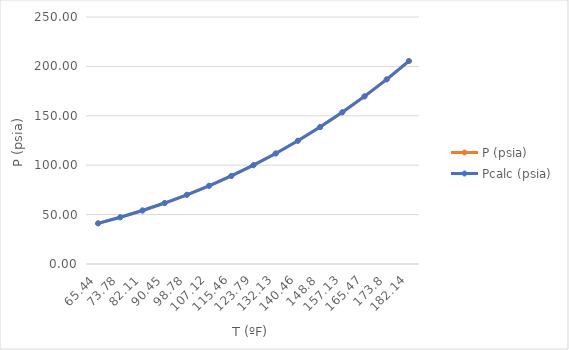
| Category | P (psia) | Pcalc (psia) |
|---|---|---|
| 65.44 | 41.17 | 41.167 |
| 73.78 | 47.32 | 47.325 |
| 82.11 | 54.15 | 54.15 |
| 90.45 | 61.7 | 61.705 |
| 98.78 | 70.02 | 70.015 |
| 107.12 | 79.15 | 79.149 |
| 115.46 | 89.14 | 89.14 |
| 123.79 | 100.03 | 100.024 |
| 132.13 | 111.87 | 111.87 |
| 140.46 | 124.7 | 124.698 |
| 148.8 | 138.58 | 138.583 |
| 157.13 | 153.54 | 153.537 |
| 165.47 | 169.64 | 169.641 |
| 173.8 | 186.9 | 186.9 |
| 182.14 | 205.39 | 205.399 |